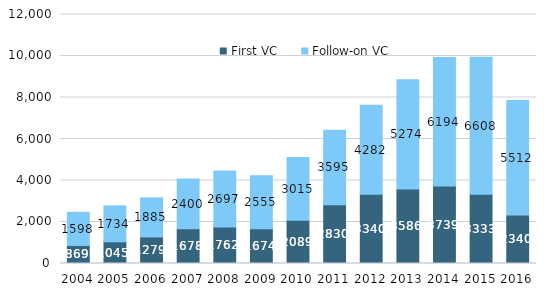
| Category | First VC | Follow-on VC |
|---|---|---|
| 2004.0 | 869 | 1598 |
| 2005.0 | 1045 | 1734 |
| 2006.0 | 1279 | 1885 |
| 2007.0 | 1678 | 2400 |
| 2008.0 | 1762 | 2697 |
| 2009.0 | 1674 | 2555 |
| 2010.0 | 2089 | 3015 |
| 2011.0 | 2830 | 3595 |
| 2012.0 | 3340 | 4282 |
| 2013.0 | 3586 | 5274 |
| 2014.0 | 3739 | 6194 |
| 2015.0 | 3333 | 6608 |
| 2016.0 | 2340 | 5512 |